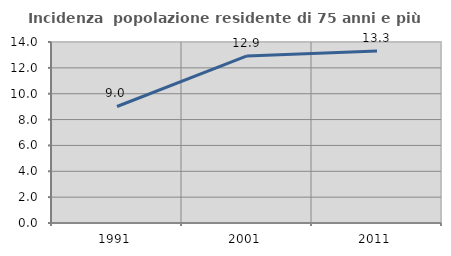
| Category | Incidenza  popolazione residente di 75 anni e più |
|---|---|
| 1991.0 | 9.011 |
| 2001.0 | 12.919 |
| 2011.0 | 13.302 |